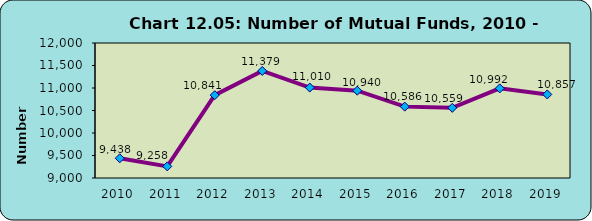
| Category | Mutual Funds |
|---|---|
| 2010.0 | 9438 |
| 2011.0 | 9258 |
| 2012.0 | 10841 |
| 2013.0 | 11379 |
| 2014.0 | 11010 |
| 2015.0 | 10940 |
| 2016.0 | 10586 |
| 2017.0 | 10559 |
| 2018.0 | 10992 |
| 2019.0 | 10857 |